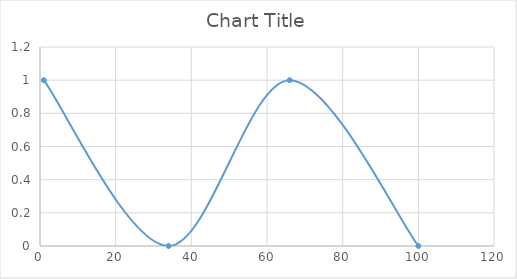
| Category | Series 0 |
|---|---|
| 1.0 | 1 |
| 34.0 | 0 |
| 66.0 | 1 |
| 100.0 | 0 |